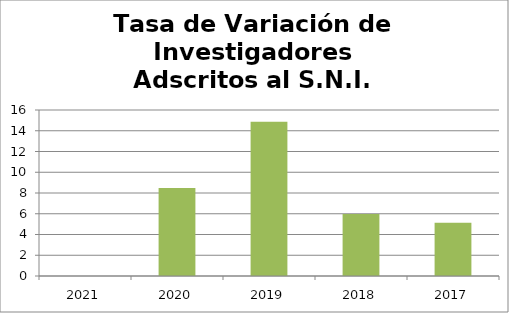
| Category | Tasa de Variación de Investigadores Adscritos al S.N.I. |
|---|---|
| 2021.0 | 0 |
| 2020.0 | 8.482 |
| 2019.0 | 14.872 |
| 2018.0 | 5.978 |
| 2017.0 | 5.143 |